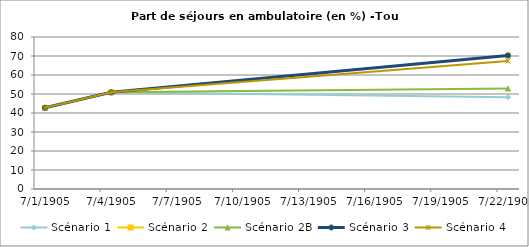
| Category | Scénario 1 | Scénario 2 | Scénario 2B | Scénario 3 | Scénario 4 |
|---|---|---|---|---|---|
| 2009.0 | 42.748 | 42.748 | 42.748 | 42.748 | 42.748 |
| 2012.0 | 50.895 | 50.895 | 50.895 | 50.895 | 50.895 |
| 2030.0 | 48.33 | 70.268 | 52.849 | 70.268 | 67.352 |